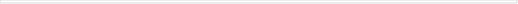
| Category | Total basic infrastructure | Private | Federal | S&L  |
|---|---|---|---|---|
| 0 | 29809.831 | 16782 | 1318.84 | 11708.991 |
| 1 | 38947.622 | 20159 | 2777.84 | 16010.782 |
| 2 | 50447.244 | 23994 | 3399.66 | 23053.584 |
| 3 | 57093.327 | 25041 | 3900.283 | 28152.044 |
| 4 | 54428.568 | 24558 | 4820.011 | 25050.557 |
| 5 | 58125.056 | 26740 | 4982.753 | 26402.303 |
| 6 | 67028.659 | 29344 | 4732.43 | 32952.229 |
| 7 | 73084.996 | 23867 | 3753.045 | 45464.951 |
| 8 | 73001.197 | 19472 | 2651.354 | 50877.843 |
| 9 | 77910.105 | 21777 | 2964.505 | 53168.6 |
| 10 | 84134.353 | 24735 | 3699.824 | 55699.529 |
| 11 | 89569.668 | 20875 | 4620.736 | 64073.932 |
| 12 | 92736.425 | 17309 | 4974.004 | 70453.421 |
| 13 | 91220.321 | 17101 | 5592.736 | 68526.585 |
| 14 | 95911.04 | 13794 | 6656.601 | 75460.439 |
| 15 | 97629.89 | 13198 | 7261.192 | 77170.698 |
| 16 | 105736.971 | 13243 | 7309.87 | 85184.101 |
| 17 | 113683.645 | 16576 | 7646.016 | 89461.629 |
| 18 | 123422.535 | 21373 | 7980.125 | 94069.41 |
| 19 | 130043.137 | 26776 | 8195.219 | 95071.918 |
| 20 | 135267.46 | 34259 | 5779.228 | 95229.232 |
| 21 | 147315.248 | 40359 | 4739.255 | 102216.993 |
| 22 | 130508.328 | 37380 | 3321.48 | 89806.848 |
| 23 | 121458.769 | 36812 | 3359.441 | 81287.328 |
| 24 | 115070.264 | 35419 | 4095.944 | 75555.32 |
| 25 | 113854.517 | 39396 | 4211.73 | 70246.787 |
| 26 | 110498.571 | 42131 | 4407.371 | 63960.2 |
| 27 | 98468.344 | 35660 | 4115.275 | 58693.069 |
| 28 | 90965.534 | 32112 | 4216.219 | 54637.315 |
| 29 | 92482.569 | 33590 | 4372.646 | 54519.923 |
| 30 | 87565.094 | 30852 | 4749.831 | 51963.263 |
| 31 | 102871.105 | 28885 | 6308.586 | 67677.519 |
| 32 | 109962.086 | 28693 | 5811.991 | 75457.095 |
| 33 | 103646.358 | 26631 | 5350.408 | 71664.95 |
| 34 | 86266.927 | 25180 | 4978.967 | 56107.96 |
| 35 | 65389.731 | 17199 | 3418.857 | 44771.874 |
| 36 | 57720.363 | 10002 | 3154.618 | 44563.745 |
| 37 | 83562.567 | 21786 | 1957.328 | 59819.239 |
| 38 | 109018.913 | 35675 | 3011.683 | 70332.23 |
| 39 | 103027.294 | 27468 | 1484.106 | 74075.188 |
| 40 | 106256.563 | 28951 | 2201.869 | 75103.694 |
| 41 | 95044.963 | 14849 | 2488.079 | 77707.884 |
| 42 | 94132.465 | 17255 | 2210.19 | 74667.275 |
| 43 | 106041.893 | 21563 | 1464.919 | 83013.974 |
| 44 | 104175.406 | 20975 | 1921.886 | 81278.52 |
| 45 | 103089.691 | 20613 | 2963.156 | 79513.535 |
| 46 | 106739.328 | 23483 | 2857.457 | 80398.871 |
| 47 | 96257.072 | 11796 | 2644.003 | 81817.069 |
| 48 | 97291.561 | 21018 | 2377.619 | 73895.942 |
| 49 | 95123.276 | 18790 | 850.596 | 75482.68 |
| 50 | 90496.699 | 13078 | -314.411 | 77733.11 |
| 51 | 103682.102 | 23478 | -444.147 | 80648.249 |
| 52 | 109074.375 | 22144 | -145.481 | 87075.856 |
| 53 | 130121.544 | 37208 | -31.287 | 92944.831 |
| 54 | 140108.699 | 38397 | 398.66 | 101313.039 |
| 55 | 137164.088 | 32025 | 1194.323 | 103944.765 |
| 56 | 136075.782 | 30913 | 1604.086 | 103558.696 |
| 57 | 113651.786 | 14717 | 1313.522 | 97621.264 |
| 58 | 103549.063 | 16960 | 360.353 | 86228.71 |
| 59 | 111077.645 | 27167 | 456.343 | 83454.302 |
| 60 | 130355.174 | 54440 | -32.289 | 75947.463 |
| 61 | 132167.731 | 61351 | -62.196 | 70878.927 |
| 62 | 133008.178 | 57055 | 880.139 | 75073.039 |
| 63 | 116042.262 | 42983 | 2651.799 | 70407.463 |
| 64 | 103785.424 | 40915 | 2498.897 | 60371.527 |
| 65 | 112835.409 | 61538 | 526.641 | 50770.768 |
| 66 | 100694.546 | 55761 | -195.146 | 45128.692 |
| 67 | 117899.312 | 70623 | 266.964 | 47009.348 |
| 68 | 114655.595 | 61519 | 1246.82 | 51889.775 |
| 69 | 113680.358 | 60762 | 986.004 | 51932.354 |
| 70 | 104263.11 | 58202 | 137.848 | 45923.262 |